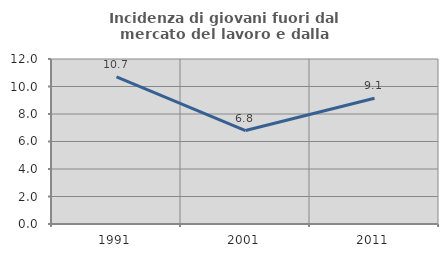
| Category | Incidenza di giovani fuori dal mercato del lavoro e dalla formazione  |
|---|---|
| 1991.0 | 10.7 |
| 2001.0 | 6.796 |
| 2011.0 | 9.146 |